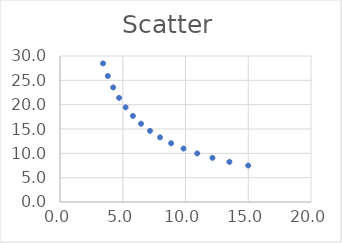
| Category | Y-Values |
|---|---|
| 15.0 | 7.5 |
| 13.5 | 8.25 |
| 12.15 | 9.075 |
| 10.935 | 9.983 |
| 9.8415 | 10.981 |
| 8.85735 | 12.079 |
| 7.971615000000001 | 13.287 |
| 7.174453500000001 | 14.615 |
| 6.457008150000001 | 16.077 |
| 5.811307335000001 | 17.685 |
| 5.230176601500001 | 19.453 |
| 4.707158941350001 | 21.398 |
| 4.236443047215001 | 23.538 |
| 3.8127987424935013 | 25.892 |
| 3.4315188682441513 | 28.481 |